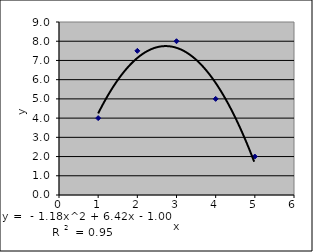
| Category | Series 0 |
|---|---|
| 1.0 | 4 |
| 2.0 | 7.5 |
| 3.0 | 8 |
| 4.0 | 5 |
| 5.0 | 2 |